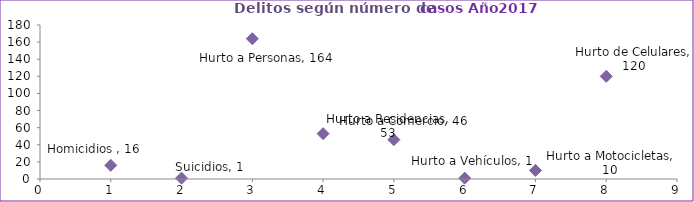
| Category | Series 0 |
|---|---|
| 0 | 16 |
| 1 | 1 |
| 2 | 164 |
| 3 | 53 |
| 4 | 46 |
| 5 | 1 |
| 6 | 10 |
| 7 | 120 |